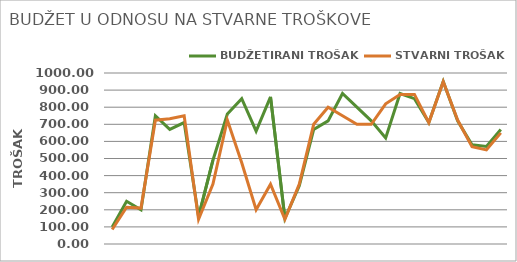
| Category | BUDŽETIRANI TROŠAK | STVARNI TROŠAK |
|---|---|---|
| 0 | 100 | 85 |
| 1 | 250 | 215 |
| 2 | 200 | 210 |
| 3 | 750 | 724 |
| 4 | 670 | 733 |
| 5 | 710 | 750 |
| 6 | 160 | 145 |
| 7 | 490 | 350 |
| 8 | 760 | 725 |
| 9 | 850 | 475 |
| 10 | 660 | 200 |
| 11 | 860 | 350 |
| 12 | 150 | 144 |
| 13 | 340 | 350 |
| 14 | 670 | 700 |
| 15 | 720 | 800 |
| 16 | 880 | 750 |
| 17 | 800 | 700 |
| 18 | 720 | 700 |
| 19 | 620 | 820 |
| 20 | 880 | 875 |
| 21 | 850 | 875 |
| 22 | 710 | 710 |
| 23 | 950 | 949 |
| 24 | 720 | 725 |
| 25 | 580 | 569 |
| 26 | 570 | 550 |
| 27 | 670 | 650 |